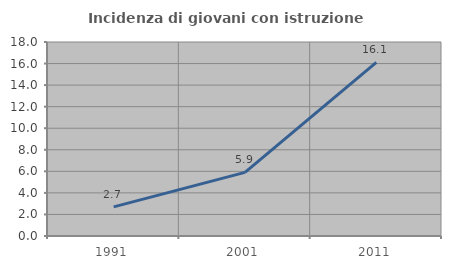
| Category | Incidenza di giovani con istruzione universitaria |
|---|---|
| 1991.0 | 2.703 |
| 2001.0 | 5.907 |
| 2011.0 | 16.117 |